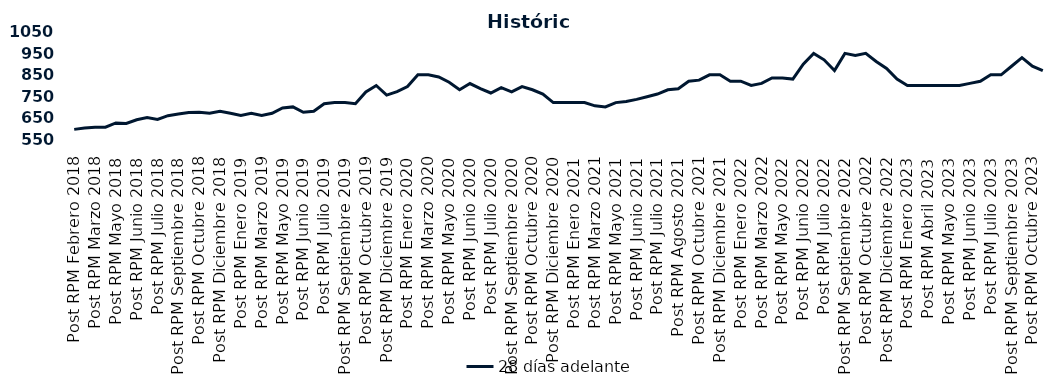
| Category | 28 días adelante |
|---|---|
| Post RPM Febrero 2018 | 595 |
| Pre RPM Marzo 2018 | 601 |
| Post RPM Marzo 2018 | 605 |
| Pre RPM Mayo 2018 | 605 |
| Post RPM Mayo 2018 | 625 |
| Pre RPM Junio 2018 | 623 |
| Post RPM Junio 2018 | 640 |
| Pre RPM Julio 2018 | 650 |
| Post RPM Julio 2018 | 641 |
| Pre RPM Septiembre 2018 | 659 |
| Post RPM Septiembre 2018 | 666.75 |
| Pre RPM Octubre 2018 | 674 |
| Post RPM Octubre 2018 | 675 |
| Pre RPM Diciembre 2018 | 670 |
| Post RPM Diciembre 2018 | 680 |
| Pre RPM Enero 2019 | 670 |
| Post RPM Enero 2019 | 660 |
| Pre RPM Marzo 2019 | 670 |
| Post RPM Marzo 2019 | 660 |
| Pre RPM Mayo 2019 | 670 |
| Post RPM Mayo 2019 | 695 |
| Pre RPM Junio 2019 | 700 |
| Post RPM Junio 2019 | 675 |
| Pre RPM Julio 2019 | 680 |
| Post RPM Julio 2019 | 715 |
| Pre RPM Septiembre 2019 | 720 |
| Post RPM Septiembre 2019 | 720 |
| Pre RPM Octubre 2019 | 715 |
| Post RPM Octubre 2019 | 770 |
| Pre RPM Diciembre 2019 | 800 |
| Post RPM Diciembre 2019 | 755 |
| Pre RPM Enero 2020 | 771 |
| Post RPM Enero 2020 | 795 |
| Pre RPM Marzo 2020 | 850 |
| Post RPM Marzo 2020 | 850 |
| Pre RPM Mayo 2020 | 840 |
| Post RPM Mayo 2020 | 815 |
| Pre RPM Junio 2020 | 780 |
| Post RPM Junio 2020 | 809 |
| Pre RPM Julio 2020 | 785.72 |
| Post RPM Julio 2020 | 765 |
| Pre RPM Septiembre 2020 | 790 |
| Post RPM Septiembre 2020 | 770 |
| Pre RPM Octubre 2020 | 795 |
| Post RPM Octubre 2020 | 780 |
| Pre RPM Diciembre 2020 | 760 |
| Post RPM Diciembre 2020 | 720 |
| Pre RPM Enero 2021 | 720 |
| Post RPM Enero 2021 | 720 |
| Pre RPM Marzo 2021 | 720 |
| Post RPM Marzo 2021 | 705 |
| Pre RPM Mayo 2021 | 700 |
| Post RPM Mayo 2021 | 720 |
| Pre RPM Junio 2021 | 725 |
| Post RPM Junio 2021 | 735 |
| Pre RPM Julio 2021 | 747.5 |
| Post RPM Julio 2021 | 760 |
| Pre RPM Agosto 2021 | 780 |
| Post RPM Agosto 2021 | 785 |
| Pre RPM Octubre 2021 | 820 |
| Post RPM Octubre 2021 | 825 |
| Pre RPM Diciembre 2021 | 850 |
| Post RPM Diciembre 2021 | 850 |
| Pre RPM Enero 2022 | 820 |
| Post RPM Enero 2022 | 820 |
| Pre RPM Marzo 2022 | 800 |
| Post RPM Marzo 2022 | 810 |
| Pre RPM Mayo 2022 | 835 |
| Post RPM Mayo 2022 | 835 |
| Pre RPM Junio 2022 | 830 |
| Post RPM Junio 2022 | 900 |
| Pre RPM Julio 2022 | 950 |
| Post RPM Julio 2022 | 920 |
| Pre RPM Septiembre 2022 | 870 |
| Post RPM Septiembre 2022 | 950 |
| Pre RPM Octubre 2022 | 940 |
| Post RPM Octubre 2022 | 950 |
| Pre RPM Diciembre 2022 | 912.5 |
| Post RPM Diciembre 2022 | 880 |
| Pre RPM Enero 2023 | 830 |
| Post RPM Enero 2023 | 800 |
| Pre RPM Abril 2023 | 800 |
| Post RPM Abril 2023 | 800 |
| Pre RPM Mayo 2023 | 800 |
| Post RPM Mayo 2023 | 800 |
| Pre RPM Junio 2023 | 800 |
| Post RPM Junio 2023 | 810 |
| Pre RPM Julio 2023 | 820 |
| Post RPM Julio 2023 | 850 |
| Pre RPM Septiembre 2023 | 850 |
| Post RPM Septiembre 2023 | 890 |
| Pre RPM Octubre 2023 | 930 |
| Post RPM Octubre 2023 | 890 |
| Pre RPM Diciembre 2023 | 870 |